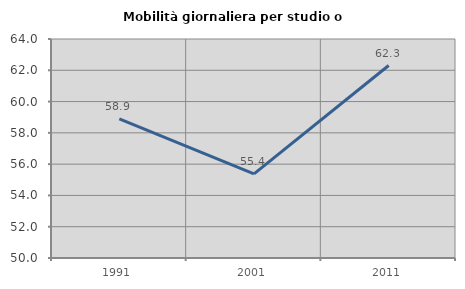
| Category | Mobilità giornaliera per studio o lavoro |
|---|---|
| 1991.0 | 58.899 |
| 2001.0 | 55.376 |
| 2011.0 | 62.305 |